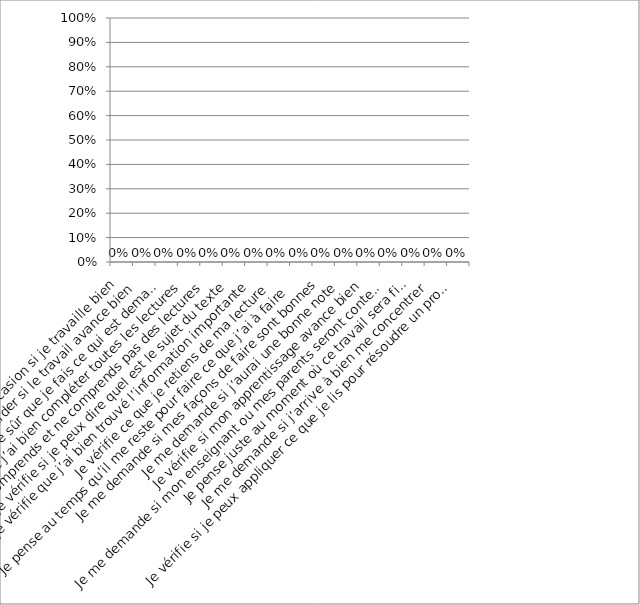
| Category | Series 0 |
|---|---|
| Je vérifie à l’occasion si je travaille bien | 0 |
| Je ne pense pas à regarder si le travail avance bien | 0 |
| Je revois les consignes pour être sûr que je fais ce qui est demandé | 0 |
| Je vérifie que j’ai bien compléter toutes les lectures  | 0 |
| Je vérifie ce que je comprends et ne comprends pas des lectures | 0 |
| Je vérifie si je peux dire quel est le sujet du texte | 0 |
| Je vérifie que j’ai bien trouvé l’information importante  | 0 |
| Je vérifie ce que je retiens de ma lecture  | 0 |
| Je pense au temps qu’il me reste pour faire ce que j’ai à faire  | 0 |
| Je me demande si mes façons de faire sont bonnes | 0 |
| Je me demande si j’aurai une bonne note | 0 |
| Je vérifie si mon apprentissage avance bien | 0 |
| Je me demande si mon enseignant ou mes parents seront contents de mon travail | 0 |
| Je pense juste au moment où ce travail sera fini | 0 |
| Je me demande si j’arrive à bien me concentrer  | 0 |
| Je vérifie si je peux appliquer ce que je lis pour résoudre un problème ou répondre à des questions | 0 |